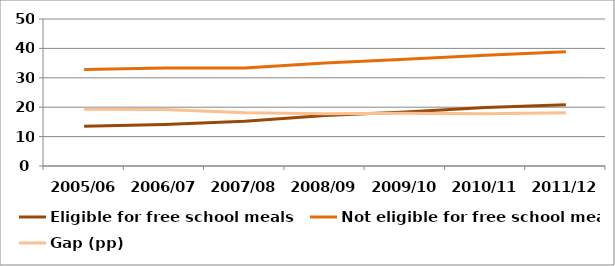
| Category | Eligible for free school meals | Not eligible for free school meals | Gap (pp) |
|---|---|---|---|
| 2005/06 | 13.5 | 32.8 | 19.3 |
| 2006/07 | 14.1 | 33.3 | 19.2 |
| 2007/08 | 15.2 | 33.3 | 18.1 |
| 2008/09 | 17.2 | 35 | 17.8 |
| 2009/10 | 18.4 | 36.3 | 17.9 |
| 2010/11 | 19.9 | 37.7 | 17.8 |
| 2011/12 | 20.8 | 38.9 | 18.1 |